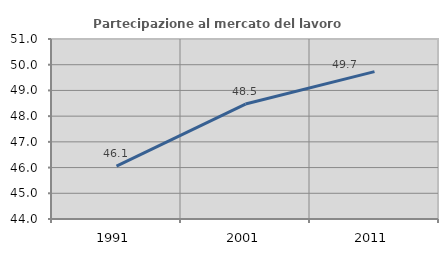
| Category | Partecipazione al mercato del lavoro  femminile |
|---|---|
| 1991.0 | 46.06 |
| 2001.0 | 48.471 |
| 2011.0 | 49.73 |